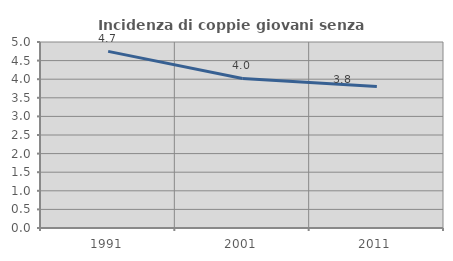
| Category | Incidenza di coppie giovani senza figli |
|---|---|
| 1991.0 | 4.747 |
| 2001.0 | 4.021 |
| 2011.0 | 3.802 |